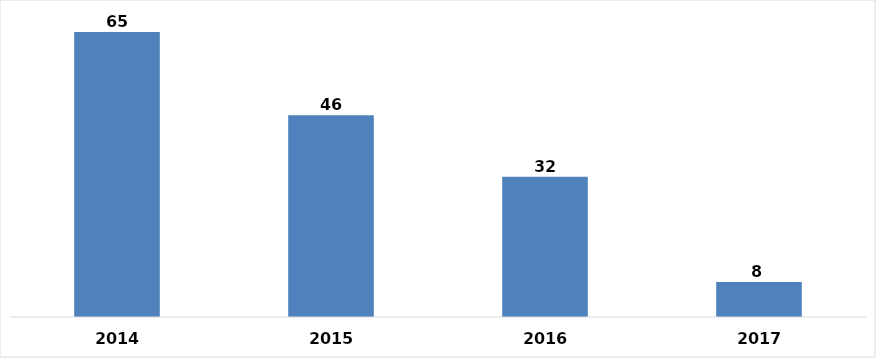
| Category | 2014 |
|---|---|
| 0 | 65 |
| 1 | 46 |
| 2 | 32 |
| 3 | 8 |